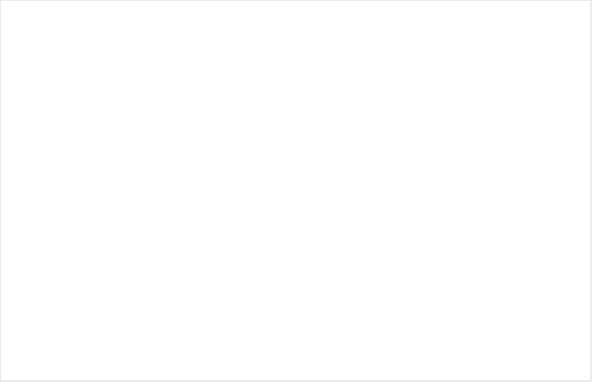
| Category | Ingen brist | Föreläggande | Föreläggande vid vite | Anmärkning |
|---|---|---|---|---|
| Enskild en enhet | 0.712 | 0.25 | 0.038 | 0 |
| Enskild flera enhet | 0.77 | 0.203 | 0 | 0.027 |
| Offentlig | 0.751 | 0.209 | 0.019 | 0.021 |